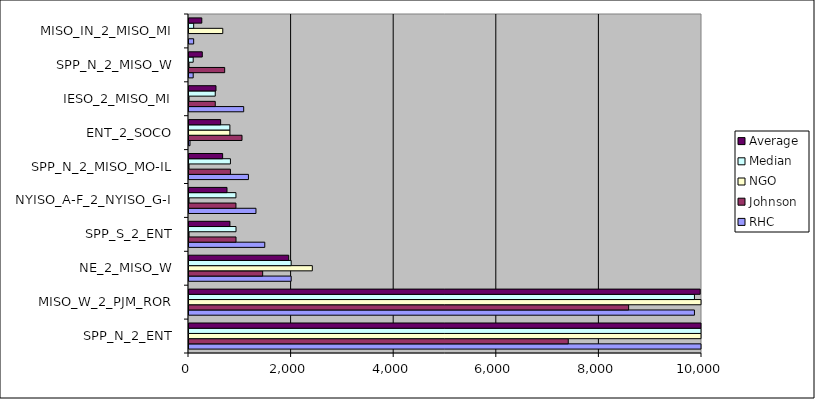
| Category | RHC | Johnson | NGO | Median | Average |
|---|---|---|---|---|---|
| SPP_N_2_ENT | 16163.828 | 7392.862 | 10122.68 | 10122.68 | 11226.457 |
| MISO_W_2_PJM_ROR | 9852.7 | 8569.947 | 11472.69 | 9852.7 | 9965.112 |
| NE_2_MISO_W | 1991.432 | 1436.134 | 2404.01 | 1991.432 | 1943.859 |
| SPP_S_2_ENT | 1476.951 | 916.391 | 0.37 | 916.391 | 797.904 |
| NYISO_A-F_2_NYISO_G-I | 1305.288 | 915.17 | 0.94 | 915.17 | 740.466 |
| SPP_N_2_MISO_MO-IL | 1158.575 | 807.721 | 0.23 | 807.721 | 655.508 |
| ENT_2_SOCO | 19.664 | 1033.418 | 797.04 | 797.04 | 616.707 |
| IESO_2_MISO_MI | 1066.145 | 511.879 | 0.02 | 511.879 | 526.014 |
| SPP_N_2_MISO_W | 81.849 | 695.651 | 0.07 | 81.849 | 259.19 |
| MISO_IN_2_MISO_MI | 90.929 | 0 | 658.21 | 90.929 | 249.713 |